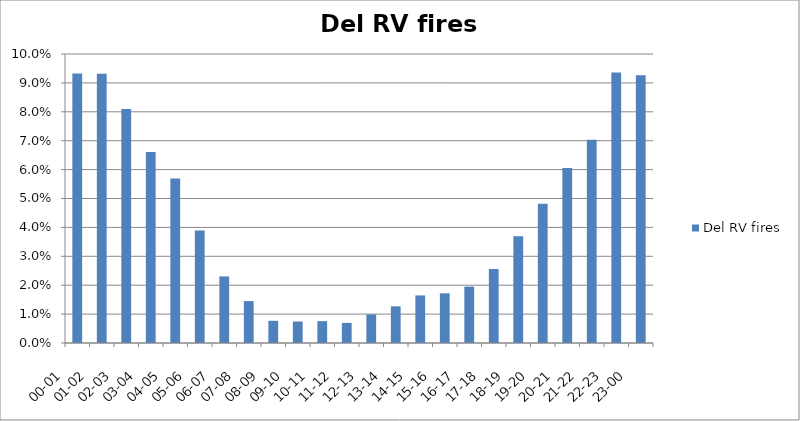
| Category | Del RV fires |
|---|---|
| 00-01      | 0.093 |
| 01-02      | 0.093 |
| 02-03      | 0.081 |
| 03-04      | 0.066 |
| 04-05      | 0.057 |
| 05-06      | 0.039 |
| 06-07      | 0.023 |
| 07-08      | 0.015 |
| 08-09      | 0.008 |
| 09-10      | 0.007 |
| 10-11      | 0.008 |
| 11-12      | 0.007 |
| 12-13      | 0.01 |
| 13-14      | 0.013 |
| 14-15      | 0.016 |
| 15-16      | 0.017 |
| 16-17      | 0.02 |
| 17-18      | 0.026 |
| 18-19      | 0.037 |
| 19-20      | 0.048 |
| 20-21      | 0.061 |
| 21-22      | 0.07 |
| 22-23      | 0.094 |
| 23-00      | 0.093 |